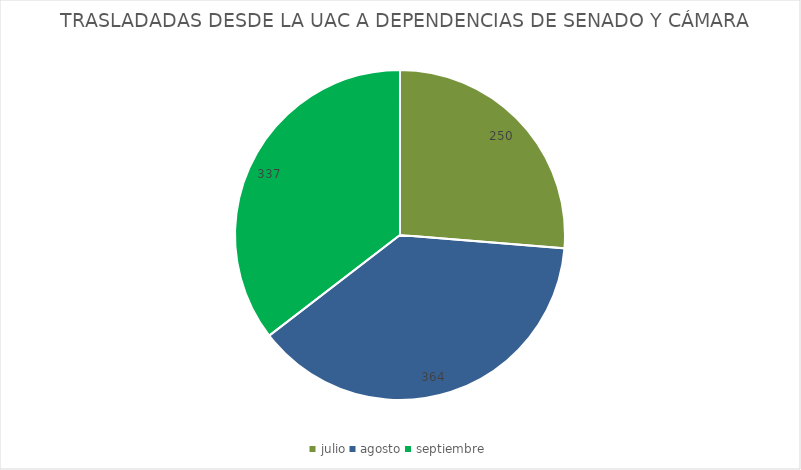
| Category | TRASLADADAS DESDE LA UAC A DEPENDENCIAS DE SENADO Y CÁMARA |
|---|---|
| julio | 250 |
| agosto | 364 |
| septiembre | 337 |